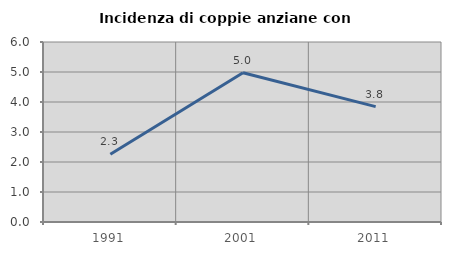
| Category | Incidenza di coppie anziane con figli |
|---|---|
| 1991.0 | 2.26 |
| 2001.0 | 4.975 |
| 2011.0 | 3.846 |